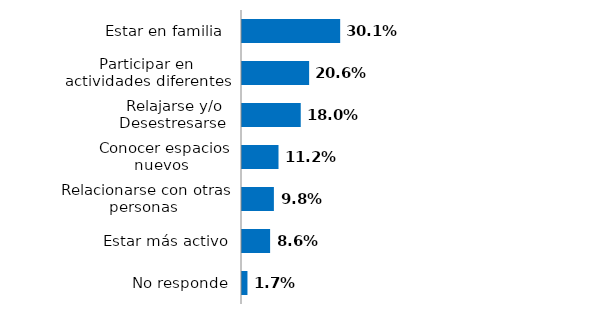
| Category | Series 0 |
|---|---|
| No responde | 0.017 |
| Estar más activo | 0.086 |
| Relacionarse con otras personas  | 0.098 |
| Conocer espacios nuevos  | 0.112 |
| Relajarse y/o Desestresarse  | 0.18 |
| Participar en actividades diferentes | 0.206 |
| Estar en familia  | 0.301 |